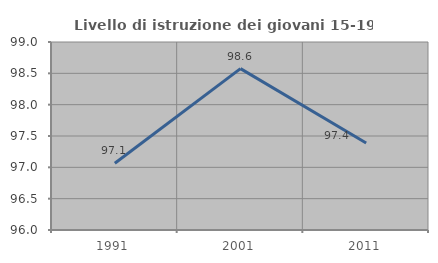
| Category | Livello di istruzione dei giovani 15-19 anni |
|---|---|
| 1991.0 | 97.064 |
| 2001.0 | 98.575 |
| 2011.0 | 97.39 |